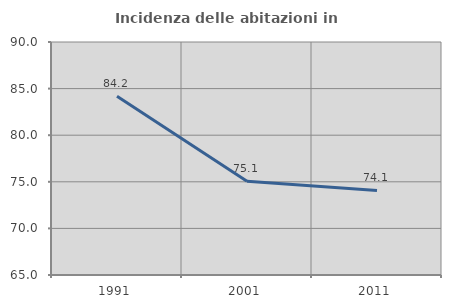
| Category | Incidenza delle abitazioni in proprietà  |
|---|---|
| 1991.0 | 84.183 |
| 2001.0 | 75.059 |
| 2011.0 | 74.079 |